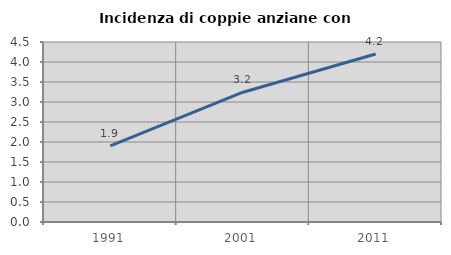
| Category | Incidenza di coppie anziane con figli |
|---|---|
| 1991.0 | 1.901 |
| 2001.0 | 3.245 |
| 2011.0 | 4.201 |